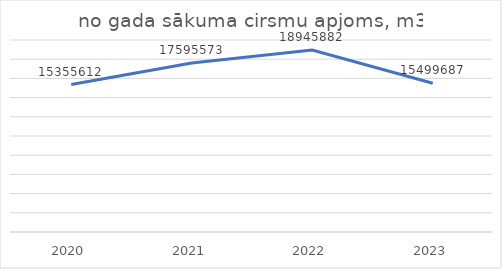
| Category | no gada sākuma cirsmu apjoms, m3 |
|---|---|
| 2020.0 | 15355612 |
| 2021.0 | 17595573 |
| 2022.0 | 18945882 |
| 2023.0 | 15499687 |